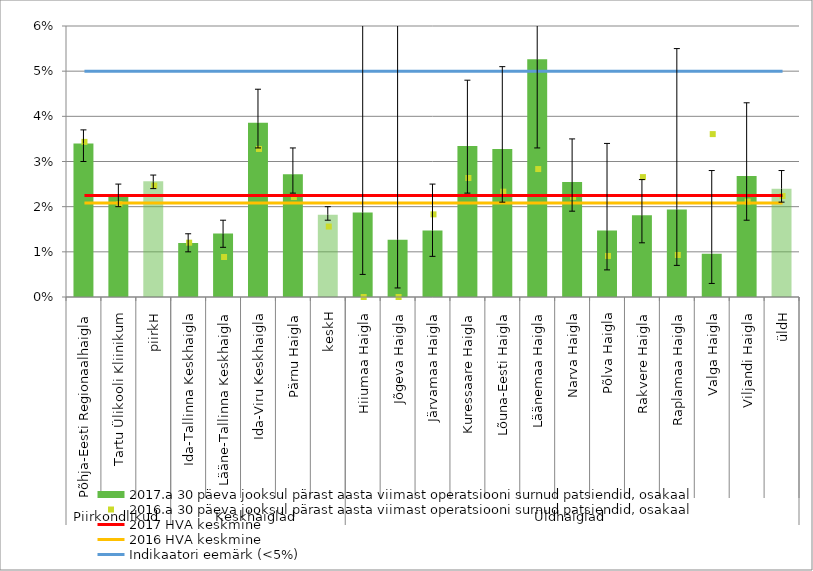
| Category | 2017.a 30 päeva jooksul pärast aasta viimast operatsiooni surnud patsiendid, osakaal  |
|---|---|
| 0 | 0.034 |
| 1 | 0.023 |
| 2 | 0.026 |
| 3 | 0.012 |
| 4 | 0.014 |
| 5 | 0.039 |
| 6 | 0.027 |
| 7 | 0.018 |
| 8 | 0.019 |
| 9 | 0.013 |
| 10 | 0.015 |
| 11 | 0.033 |
| 12 | 0.033 |
| 13 | 0.053 |
| 14 | 0.025 |
| 15 | 0.015 |
| 16 | 0.018 |
| 17 | 0.019 |
| 18 | 0.01 |
| 19 | 0.027 |
| 20 | 0.024 |